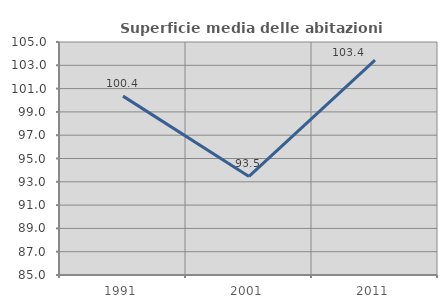
| Category | Superficie media delle abitazioni occupate |
|---|---|
| 1991.0 | 100.355 |
| 2001.0 | 93.463 |
| 2011.0 | 103.437 |